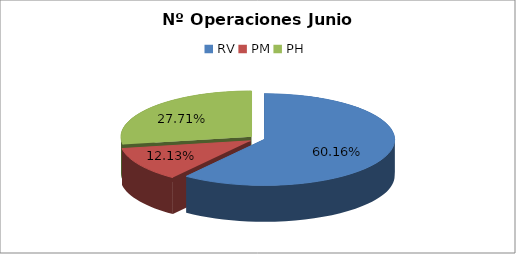
| Category | Series 0 |
|---|---|
| RV | 17970 |
| PM | 3623 |
| PH | 8279 |